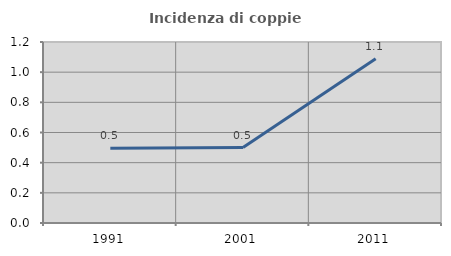
| Category | Incidenza di coppie miste |
|---|---|
| 1991.0 | 0.496 |
| 2001.0 | 0.5 |
| 2011.0 | 1.088 |